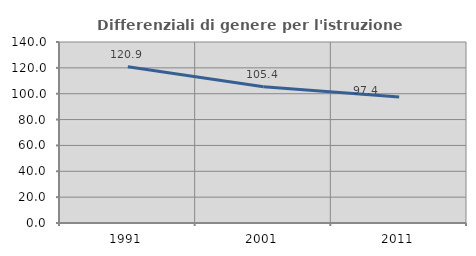
| Category | Differenziali di genere per l'istruzione superiore |
|---|---|
| 1991.0 | 120.913 |
| 2001.0 | 105.398 |
| 2011.0 | 97.408 |